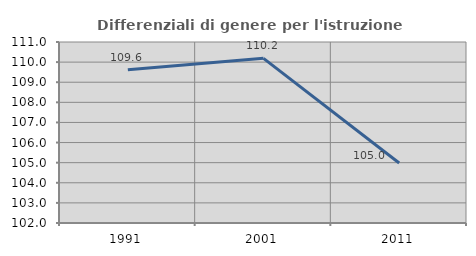
| Category | Differenziali di genere per l'istruzione superiore |
|---|---|
| 1991.0 | 109.621 |
| 2001.0 | 110.186 |
| 2011.0 | 104.984 |